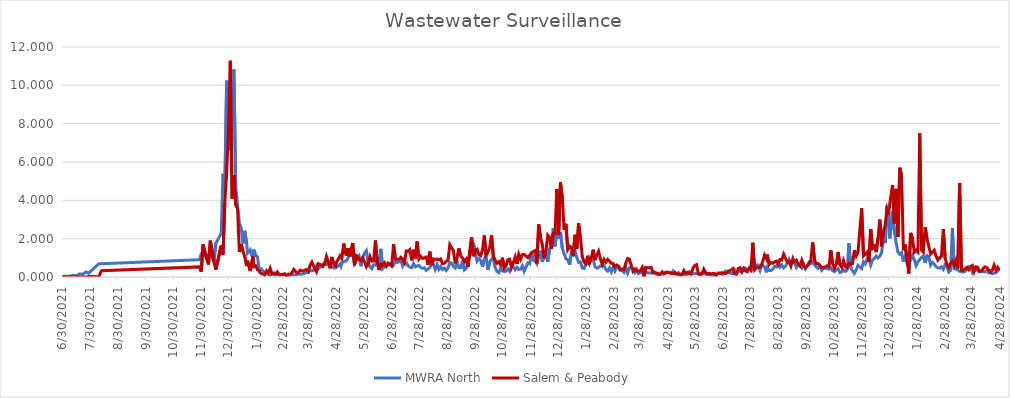
| Category | MWRA North | Salem & Peabody |
|---|---|---|
| 6/30/21 | 0.023 | 0 |
| 7/2/21 | 0.04 | 0 |
| 7/6/21 | 0.027 | 0 |
| 7/8/21 | 0.05 | 0 |
| 7/12/21 | 0.087 | 0 |
| 7/15/21 | 0.059 | 0 |
| 7/19/21 | 0.163 | 0 |
| 7/22/21 | 0.136 | 0 |
| 7/26/21 | 0.263 | 0 |
| 7/29/21 | 0.2 | 0.032 |
| 8/9/21 | 0.691 | 0.007 |
| 8/12/21 | 0.691 | 0.329 |
| 11/28/21 | 0.901 | 0.528 |
| 11/30/21 | 1.204 | 0.275 |
| 12/2/21 | 1.163 | 1.699 |
| 12/6/21 | 1.093 | 0.943 |
| 12/8/21 | 1.152 | 0.651 |
| 12/10/21 | 1.257 | 1.895 |
| 12/14/21 | 0.765 | 0.806 |
| 12/16/21 | 1.751 | 0.377 |
| 12/22/21 | 2.277 | 1.638 |
| 12/24/21 | 5.383 | 1.167 |
| 12/26/21 | 4.572 | 3.882 |
| 12/28/21 | 10.243 | 5.443 |
| 12/30/21 | 8.435 | 7.638 |
| 1/1/22 | 6.568 | 11.282 |
| 1/3/22 | 10.196 | 4.086 |
| 1/5/22 | 10.833 | 5.297 |
| 1/7/22 | 4.705 | 3.753 |
| 1/9/22 | 3.807 | 3.57 |
| 1/11/22 | 2.813 | 1.302 |
| 1/13/22 | 2.562 | 1.704 |
| 1/15/22 | 1.737 | 1.36 |
| 1/17/22 | 2.411 | 1.052 |
| 1/19/22 | 1.766 | 0.581 |
| 1/20/22 | 1.245 | 0.849 |
| 1/23/22 | 1.42 | 0.312 |
| 1/26/22 | 0.904 | 1.062 |
| 1/27/22 | 1.426 | 0.538 |
| 1/29/22 | 1.132 | 0.587 |
| 1/31/22 | 1.053 | 0.378 |
| 2/2/22 | 0.334 | 0.319 |
| 2/4/22 | 0.422 | 0.179 |
| 2/6/22 | 0.336 | 0.151 |
| 2/8/22 | 0.11 | 0.116 |
| 2/10/22 | 0.233 | 0.327 |
| 2/12/22 | 0.14 | 0.223 |
| 2/14/22 | 0.094 | 0.461 |
| 2/16/22 | 0.206 | 0.164 |
| 2/18/22 | 0.124 | 0.209 |
| 2/20/22 | 0.101 | 0.169 |
| 2/22/22 | 0.124 | 0.267 |
| 2/24/22 | 0.138 | 0.116 |
| 2/26/22 | 0.113 | 0.121 |
| 2/28/22 | 0.102 | 0.138 |
| 3/2/22 | 0.17 | 0.16 |
| 3/4/22 | 0.121 | 0.039 |
| 3/6/22 | 0.08 | 0.151 |
| 3/8/22 | 0.105 | 0.146 |
| 3/10/22 | 0.139 | 0.227 |
| 3/12/22 | 0.105 | 0.397 |
| 3/15/22 | 0.115 | 0.231 |
| 3/17/22 | 0.165 | 0.219 |
| 3/19/22 | 0.138 | 0.356 |
| 3/22/22 | 0.161 | 0.308 |
| 3/26/22 | 0.236 | 0.388 |
| 3/28/22 | 0.23 | 0.293 |
| 3/30/22 | 0.371 | 0.617 |
| 4/1/22 | 0.316 | 0.779 |
| 4/3/22 | 0.358 | 0.54 |
| 4/6/22 | 0.589 | 0.279 |
| 4/8/22 | 0.411 | 0.688 |
| 4/11/22 | 0.565 | 0.635 |
| 4/13/22 | 0.647 | 0.546 |
| 4/15/22 | 0.752 | 0.666 |
| 4/17/22 | 0.654 | 1.077 |
| 4/19/22 | 0.641 | 0.82 |
| 4/21/22 | 0.571 | 0.454 |
| 4/23/22 | 0.524 | 1.046 |
| 4/25/22 | 0.471 | 0.662 |
| 4/27/22 | 0.623 | 0.575 |
| 4/28/22 | 0.505 | 0.756 |
| 5/2/22 | 0.662 | 1.104 |
| 5/3/22 | 0.561 | 1.022 |
| 5/4/22 | 0.751 | 0.963 |
| 5/6/22 | 0.789 | 1.744 |
| 5/9/22 | 0.853 | 1.115 |
| 5/11/22 | 0.995 | 1.498 |
| 5/13/22 | 1.285 | 1.074 |
| 5/16/22 | 1.143 | 1.773 |
| 5/18/22 | 0.696 | 0.611 |
| 5/19/22 | 0.784 | 1.144 |
| 5/21/22 | 0.906 | 1.1 |
| 5/23/22 | 1.077 | 0.91 |
| 5/25/22 | 0.561 | 0.853 |
| 5/27/22 | 1.043 | 1.006 |
| 5/29/22 | 1.246 | 0.785 |
| 5/31/22 | 1.375 | 0.53 |
| 6/2/22 | 0.696 | 0.713 |
| 6/4/22 | 0.532 | 1.066 |
| 6/6/22 | 0.435 | 0.828 |
| 6/8/22 | 0.636 | 0.839 |
| 6/10/22 | 0.619 | 1.907 |
| 6/12/22 | 0.932 | 0.783 |
| 6/14/22 | 0.461 | 0.361 |
| 6/16/22 | 1.468 | 0.667 |
| 6/18/22 | 0.433 | 0.622 |
| 6/20/22 | 0.532 | 0.737 |
| 6/22/22 | 0.611 | 0.559 |
| 6/24/22 | 0.648 | 0.724 |
| 6/26/22 | 0.688 | 0.646 |
| 6/28/22 | 0.562 | 0.577 |
| 6/30/22 | 0.607 | 1.712 |
| 7/2/22 | 0.8 | 0.932 |
| 7/4/22 | 0.751 | 0.927 |
| 7/6/22 | 0.8 | 0.928 |
| 7/8/22 | 0.861 | 1.027 |
| 7/10/22 | 0.579 | 0.928 |
| 7/12/22 | 0.808 | 0.757 |
| 7/14/22 | 0.742 | 1.358 |
| 7/16/22 | 0.592 | 1.335 |
| 7/18/22 | 0.509 | 1.432 |
| 7/20/22 | 0.482 | 0.863 |
| 7/22/22 | 0.695 | 1.416 |
| 7/24/22 | 0.53 | 0.974 |
| 7/26/22 | 0.576 | 1.848 |
| 7/28/22 | 0.605 | 0.943 |
| 7/30/22 | 0.492 | 1.081 |
| 8/1/22 | 0.453 | 0.969 |
| 8/3/22 | 0.481 | 1.003 |
| 8/5/22 | 0.349 | 1.038 |
| 8/7/22 | 0.424 | 0.634 |
| 8/9/22 | 0.492 | 1.322 |
| 8/11/22 | 0.664 | 0.624 |
| 8/13/22 | 0.648 | 0.94 |
| 8/15/22 | 0.393 | 0.912 |
| 8/17/22 | 0.648 | 0.935 |
| 8/19/22 | 0.397 | 0.892 |
| 8/21/22 | 0.546 | 0.94 |
| 8/23/22 | 0.392 | 0.701 |
| 8/25/22 | 0.461 | 0.713 |
| 8/27/22 | 0.339 | 0.812 |
| 8/29/22 | 0.46 | 0.873 |
| 8/31/22 | 0.758 | 1.69 |
| 9/2/22 | 0.728 | 1.519 |
| 9/4/22 | 0.557 | 1.377 |
| 9/6/22 | 0.473 | 0.706 |
| 9/8/22 | 0.826 | 1.041 |
| 9/10/22 | 0.485 | 1.497 |
| 9/12/22 | 0.489 | 1.095 |
| 9/14/22 | 0.851 | 0.994 |
| 9/16/22 | 0.375 | 0.804 |
| 9/18/22 | 0.45 | 0.926 |
| 9/20/22 | 0.767 | 0.537 |
| 9/24/22 | 1.357 | 2.067 |
| 9/26/22 | 1.79 | 1.083 |
| 9/28/22 | 1.272 | 1.382 |
| 9/30/22 | 0.825 | 1.447 |
| 10/2/22 | 0.959 | 1.18 |
| 10/4/22 | 0.862 | 1.109 |
| 10/6/22 | 0.536 | 1.407 |
| 10/8/22 | 0.925 | 2.166 |
| 10/10/22 | 1.104 | 1.147 |
| 10/12/22 | 0.369 | 1.304 |
| 10/14/22 | 0.781 | 1.544 |
| 10/16/22 | 0.928 | 2.189 |
| 10/18/22 | 0.972 | 1.054 |
| 10/20/22 | 0.493 | 0.883 |
| 10/22/22 | 0.287 | 0.721 |
| 10/24/22 | 0.224 | 0.803 |
| 10/26/22 | 0.45 | 0.639 |
| 10/28/22 | 0.325 | 1.007 |
| 10/30/22 | 0.287 | 0.464 |
| 11/1/22 | 0.307 | 0.6 |
| 11/3/22 | 0.421 | 0.904 |
| 11/5/22 | 0.293 | 0.926 |
| 11/7/22 | 0.54 | 0.505 |
| 11/9/22 | 0.525 | 0.742 |
| 11/11/22 | 0.38 | 1.039 |
| 11/13/22 | 0.5 | 0.678 |
| 11/15/22 | 0.397 | 1.19 |
| 11/17/22 | 0.414 | 0.927 |
| 11/19/22 | 0.583 | 1.166 |
| 11/21/22 | 0.304 | 1.181 |
| 11/25/22 | 0.727 | 1.009 |
| 11/27/22 | 0.682 | 1.128 |
| 11/29/22 | 1.292 | 1.263 |
| 12/1/22 | 0.879 | 1.332 |
| 12/3/22 | 0.834 | 1.378 |
| 12/5/22 | 0.685 | 0.71 |
| 12/7/22 | 1.094 | 2.747 |
| 12/9/22 | 1.37 | 2.05 |
| 12/11/22 | 0.792 | 1.692 |
| 12/13/22 | 1.108 | 0.983 |
| 12/15/22 | 1.123 | 1.348 |
| 12/17/22 | 0.789 | 2.185 |
| 12/19/22 | 1.476 | 2.073 |
| 12/21/22 | 1.593 | 1.47 |
| 12/23/22 | 2.551 | 2.278 |
| 12/25/22 | 1.597 | 2.275 |
| 12/27/22 | 2.423 | 4.578 |
| 12/29/22 | 2.003 | 2.196 |
| 12/31/22 | 2.33 | 4.939 |
| 1/2/23 | 1.499 | 4.153 |
| 1/4/23 | 1.214 | 2.457 |
| 1/6/23 | 0.947 | 2.778 |
| 1/8/23 | 0.904 | 1.437 |
| 1/10/23 | 0.64 | 1.61 |
| 1/12/23 | 1.241 | 1.532 |
| 1/14/23 | 1.154 | 1.092 |
| 1/16/23 | 1.37 | 2.202 |
| 1/18/23 | 1.009 | 1.465 |
| 1/20/23 | 0.763 | 2.809 |
| 1/22/23 | 0.787 | 2.022 |
| 1/24/23 | 0.465 | 1.08 |
| 1/26/23 | 0.448 | 0.782 |
| 1/28/23 | 0.685 | 0.698 |
| 1/30/23 | 0.689 | 1.11 |
| 2/1/23 | 0.706 | 0.743 |
| 2/3/23 | 0.907 | 1.008 |
| 2/5/23 | 0.913 | 1.425 |
| 2/7/23 | 0.539 | 0.879 |
| 2/9/23 | 0.461 | 1.141 |
| 2/11/23 | 0.498 | 1.339 |
| 2/13/23 | 0.579 | 0.95 |
| 2/15/23 | 0.588 | 0.66 |
| 2/17/23 | 0.592 | 0.919 |
| 2/19/23 | 0.391 | 0.773 |
| 2/21/23 | 0.312 | 0.917 |
| 2/23/23 | 0.472 | 0.828 |
| 2/25/23 | 0.266 | 0.714 |
| 2/27/23 | 0.513 | 0.704 |
| 3/1/23 | 0.321 | 0.528 |
| 3/3/23 | 0.58 | 0.61 |
| 3/5/23 | 0.437 | 0.573 |
| 3/7/23 | 0.341 | 0.388 |
| 3/9/23 | 0.33 | 0.412 |
| 3/11/23 | 0.24 | 0.383 |
| 3/13/23 | 0.499 | 0.725 |
| 3/15/23 | 0.197 | 0.964 |
| 3/17/23 | 0.479 | 0.931 |
| 3/19/23 | 0.51 | 0.612 |
| 3/21/23 | 0.399 | 0.301 |
| 3/23/23 | 0.237 | 0.415 |
| 3/25/23 | 0.395 | 0.308 |
| 3/27/23 | 0.178 | 0.314 |
| 3/29/23 | 0.217 | 0.326 |
| 3/31/23 | 0.243 | 0.491 |
| 4/2/23 | 0.43 | 0.024 |
| 4/4/23 | 0.215 | 0.5 |
| 4/6/23 | 0.229 | 0.475 |
| 4/8/23 | 0.202 | 0.481 |
| 4/10/23 | 0.209 | 0.497 |
| 4/12/23 | 0.305 | 0.215 |
| 4/14/23 | 0.182 | 0.243 |
| 4/16/23 | 0.142 | 0.21 |
| 4/18/23 | 0.177 | 0.143 |
| 4/20/23 | 0.158 | 0.13 |
| 4/22/23 | 0.195 | 0.266 |
| 4/24/23 | 0.209 | 0.158 |
| 4/26/23 | 0.195 | 0.249 |
| 4/28/23 | 0.245 | 0.25 |
| 4/30/23 | 0.245 | 0.228 |
| 5/2/23 | 0.18 | 0.185 |
| 5/4/23 | 0.314 | 0.177 |
| 5/6/23 | 0.157 | 0.247 |
| 5/8/23 | 0.162 | 0.165 |
| 5/10/23 | 0.234 | 0.135 |
| 5/12/23 | 0.1 | 0.143 |
| 5/14/23 | 0.1 | 0.144 |
| 5/16/23 | 0.156 | 0.338 |
| 5/18/23 | 0.134 | 0.195 |
| 5/20/23 | 0.141 | 0.237 |
| 5/22/23 | 0.279 | 0.178 |
| 5/24/23 | 0.223 | 0.15 |
| 5/26/23 | 0.176 | 0.458 |
| 5/28/23 | 0.176 | 0.602 |
| 5/30/23 | 0.183 | 0.643 |
| 6/1/23 | 0.153 | 0.167 |
| 6/3/23 | 0.172 | 0.13 |
| 6/5/23 | 0.198 | 0.156 |
| 6/7/23 | 0.243 | 0.409 |
| 6/9/23 | 0.143 | 0.231 |
| 6/11/23 | 0.143 | 0.16 |
| 6/13/23 | 0.122 | 0.195 |
| 6/15/23 | 0.11 | 0.156 |
| 6/17/23 | 0.095 | 0.181 |
| 6/19/23 | 0.054 | 0.18 |
| 6/21/23 | 0.122 | 0.089 |
| 6/23/23 | 0.195 | 0.208 |
| 6/25/23 | 0.195 | 0.187 |
| 6/27/23 | 0.141 | 0.225 |
| 6/29/23 | 0.16 | 0.211 |
| 7/1/23 | 0.31 | 0.183 |
| 7/3/23 | 0.312 | 0.225 |
| 7/5/23 | 0.244 | 0.321 |
| 7/7/23 | 0.184 | 0.366 |
| 7/9/23 | 0.184 | 0.437 |
| 7/11/23 | 0.38 | 0.163 |
| 7/13/23 | 0.255 | 0.147 |
| 7/15/23 | 0.268 | 0.451 |
| 7/17/23 | 0.315 | 0.484 |
| 7/19/23 | 0.252 | 0.278 |
| 7/21/23 | 0.47 | 0.451 |
| 7/23/23 | 0.47 | 0.309 |
| 7/25/23 | 0.325 | 0.277 |
| 7/27/23 | 0.478 | 0.439 |
| 7/29/23 | 0.339 | 0.359 |
| 7/31/23 | 0.538 | 1.791 |
| 8/2/23 | 0.514 | 0.375 |
| 8/4/23 | 0.625 | 0.476 |
| 8/6/23 | 0.625 | 0.501 |
| 8/8/23 | 0.347 | 0.517 |
| 8/10/23 | 0.645 | 0.663 |
| 8/13/23 | 0.533 | 1.145 |
| 8/15/23 | 0.245 | 0.951 |
| 8/16/23 | 0.489 | 1.169 |
| 8/18/23 | 0.336 | 0.656 |
| 8/20/23 | 0.336 | 0.753 |
| 8/22/23 | 0.407 | 0.717 |
| 8/24/23 | 0.558 | 0.79 |
| 8/26/23 | 0.526 | 0.826 |
| 8/28/23 | 0.757 | 0.651 |
| 8/30/23 | 0.52 | 0.914 |
| 9/1/23 | 0.628 | 0.889 |
| 9/3/23 | 0.475 | 1.194 |
| 9/5/23 | 0.563 | 0.989 |
| 9/7/23 | 0.731 | 0.782 |
| 9/9/23 | 0.922 | 0.819 |
| 9/11/23 | 0.696 | 0.573 |
| 9/13/23 | 0.75 | 0.928 |
| 9/14/23 | 0.882 | 0.78 |
| 9/17/23 | 0.503 | 0.884 |
| 9/19/23 | 0.645 | 0.68 |
| 9/21/23 | 0.575 | 0.58 |
| 9/23/23 | 0.465 | 0.87 |
| 9/25/23 | 0.673 | 0.57 |
| 9/27/23 | 0.429 | 0.47 |
| 10/1/23 | 0.773 | 0.67 |
| 10/3/23 | 0.702 | 0.88 |
| 10/5/23 | 0.78 | 1.8 |
| 10/7/23 | 0.63 | 0.9 |
| 10/9/23 | 0.524 | 0.69 |
| 10/11/23 | 0.448 | 0.7 |
| 10/13/23 | 0.571 | 0.6 |
| 10/15/23 | 0.35 | 0.5 |
| 10/17/23 | 0.468 | 0.5 |
| 10/19/23 | 0.46 | 0.53 |
| 10/21/23 | 0.442 | 0.59 |
| 10/23/23 | 0.407 | 0.55 |
| 10/25/23 | 0.475 | 1.4 |
| 10/27/23 | 0.329 | 0.7 |
| 10/29/23 | 0.277 | 0.46 |
| 10/31/23 | 0.366 | 0.66 |
| 11/2/23 | 0.431 | 1.3 |
| 11/4/23 | 0.23 | 0.66 |
| 11/6/23 | 0.268 | 0.5 |
| 11/8/23 | 0.372 | 0.85 |
| 11/10/23 | 0.287 | 0.54 |
| 11/12/23 | 0.373 | 0.48 |
| 11/14/23 | 1.767 | 0.71 |
| 11/16/23 | 0.468 | 0.67 |
| 11/18/23 | 0.315 | 0.7 |
| 11/20/23 | 0.188 | 1.4 |
| 11/22/23 | 0.38 | 1.1 |
| 11/24/23 | 0.608 | 1.3 |
| 11/28/23 | 0.44 | 3.6 |
| 11/30/23 | 0.791 | 1.1 |
| 12/2/23 | 0.677 | 1.2 |
| 12/4/23 | 0.943 | 1.3 |
| 12/6/23 | 0.966 | 0.79 |
| 12/8/23 | 0.618 | 2.5 |
| 12/10/23 | 0.892 | 1.5 |
| 12/12/23 | 0.964 | 1.6 |
| 12/14/23 | 1.091 | 1.3 |
| 12/16/23 | 0.99 | 2 |
| 12/18/23 | 1.089 | 3 |
| 12/20/23 | 1.252 | 1.6 |
| 12/22/23 | 2.214 | 2.4 |
| 12/24/23 | 1.769 | 2.7 |
| 12/26/23 | 3.689 | 3.6 |
| 12/28/23 | 2.81 | 3.4 |
| 12/29/23 | 2.013 | 3.8 |
| 1/1/24 | 3.443 | 4.8 |
| 1/3/24 | 2.411 | 2.8 |
| 1/5/24 | 1.78 | 4.6 |
| 1/7/24 | 1.295 | 2.1 |
| 1/9/24 | 1.184 | 5.7 |
| 1/11/24 | 1.27 | 5.3 |
| 1/13/24 | 0.802 | 1.4 |
| 1/15/24 | 1.091 | 1.7 |
| 1/17/24 | 0.716 | 0.94 |
| 1/19/24 | 0.852 | 0.18 |
| 1/21/24 | 0.866 | 2.3 |
| 1/23/24 | 1.127 | 2 |
| 1/25/24 | 0.911 | 1.3 |
| 1/27/24 | 0.591 | 1.4 |
| 1/29/24 | 0.786 | 1.3 |
| 1/31/24 | 0.915 | 7.5 |
| 2/2/24 | 1.022 | 1.4 |
| 2/4/24 | 1.092 | 1.3 |
| 2/6/24 | 0.732 | 2.6 |
| 2/8/24 | 1.114 | 2 |
| 2/10/24 | 1.061 | 1.6 |
| 2/12/24 | 0.622 | 1.2 |
| 2/14/24 | 0.758 | 1.3 |
| 2/16/24 | 0.672 | 1.4 |
| 2/18/24 | 0.536 | 1.1 |
| 2/20/24 | 0.483 | 0.88 |
| 2/22/24 | 0.462 | 1 |
| 2/24/24 | 0.532 | 1.1 |
| 2/26/24 | 0.398 | 2.5 |
| 2/28/24 | 0.647 | 0.99 |
| 3/1/24 | 0.579 | 0.66 |
| 3/3/24 | 0.265 | 0.5 |
| 3/5/24 | 0.341 | 0.7 |
| 3/7/24 | 2.546 | 0.83 |
| 3/9/24 | 0.429 | 0.62 |
| 3/11/24 | 0.407 | 0.87 |
| 3/13/24 | 0.358 | 0.44 |
| 3/15/24 | 0.293 | 4.9 |
| 3/17/24 | 0.275 | 0.36 |
| 3/19/24 | 0.256 | 0.34 |
| 3/21/24 | 0.289 | 0.43 |
| 3/23/24 | 0.517 | 0.49 |
| 3/25/24 | 0.532 | 0.38 |
| 3/27/24 | 0.511 | 0.53 |
| 3/29/24 | 0.256 | 0.6 |
| 3/31/24 | 0.474 | 0.28 |
| 4/2/24 | 0.507 | 0.53 |
| 4/4/24 | 0.315 | 0.5 |
| 4/6/24 | 0.284 | 0.28 |
| 4/8/24 | 0.287 | 0.31 |
| 4/10/24 | 0.272 | 0.44 |
| 4/12/24 | 0.267 | 0.53 |
| 4/14/24 | 0.327 | 0.49 |
| 4/16/24 | 0.217 | 0.36 |
| 4/18/24 | 0.3 | 0.25 |
| 4/20/24 | 0.171 | 0.36 |
| 4/22/24 | 0.212 | 0.62 |
| 4/24/24 | 0.216 | 0.36 |
| 4/26/24 | 0.318 | 0.51 |
| 4/28/24 | 0.415 | 0.36 |